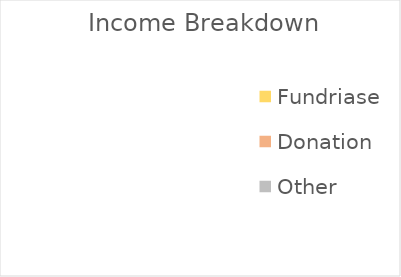
| Category | Income |
|---|---|
| Fundriase | 0 |
| Donation | 0 |
| Other | 0 |